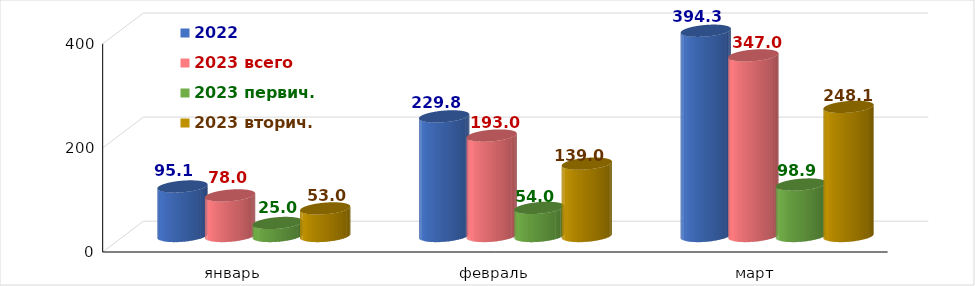
| Category | 2022 | 2023 всего | 2023 первич. | 2023 вторич. |
|---|---|---|---|---|
| январь | 95.122 | 78 | 25 | 53 |
| февраль | 229.762 | 193 | 54 | 139 |
| март | 394.318 | 347 | 98.9 | 248.1 |